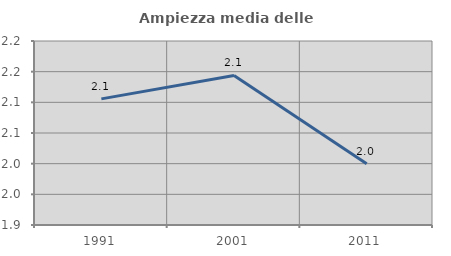
| Category | Ampiezza media delle famiglie |
|---|---|
| 1991.0 | 2.106 |
| 2001.0 | 2.144 |
| 2011.0 | 2 |